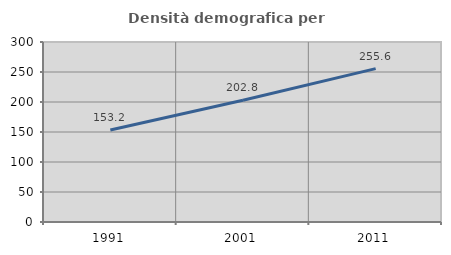
| Category | Densità demografica |
|---|---|
| 1991.0 | 153.189 |
| 2001.0 | 202.794 |
| 2011.0 | 255.568 |